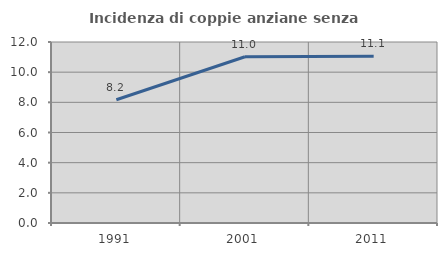
| Category | Incidenza di coppie anziane senza figli  |
|---|---|
| 1991.0 | 8.17 |
| 2001.0 | 11.025 |
| 2011.0 | 11.054 |